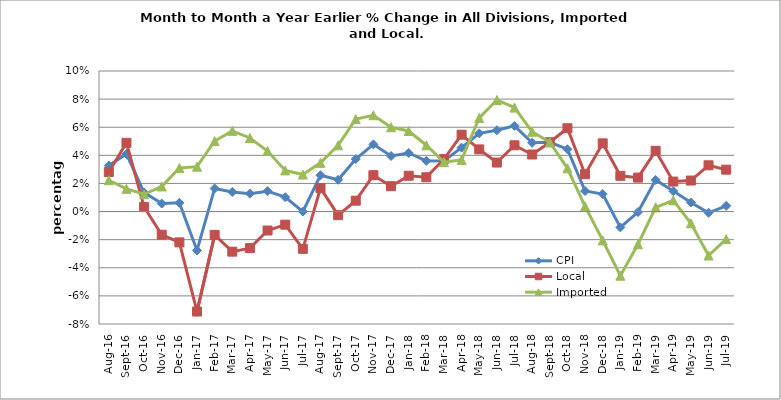
| Category | CPI | Local | Imported |
|---|---|---|---|
| 2016-08-01 | 0.033 | 0.028 | 0.022 |
| 2016-09-01 | 0.041 | 0.049 | 0.016 |
| 2016-10-01 | 0.014 | 0.003 | 0.012 |
| 2016-11-01 | 0.006 | -0.016 | 0.018 |
| 2016-12-01 | 0.006 | -0.022 | 0.031 |
| 2017-01-01 | -0.028 | -0.071 | 0.032 |
| 2017-02-01 | 0.016 | -0.017 | 0.05 |
| 2017-03-01 | 0.014 | -0.029 | 0.057 |
| 2017-04-01 | 0.013 | -0.026 | 0.052 |
| 2017-05-01 | 0.015 | -0.013 | 0.043 |
| 2017-06-01 | 0.01 | -0.009 | 0.029 |
| 2017-07-01 | 0 | -0.027 | 0.026 |
| 2017-08-01 | 0.026 | 0.017 | 0.035 |
| 2017-09-01 | 0.023 | -0.003 | 0.047 |
| 2017-10-01 | 0.037 | 0.008 | 0.066 |
| 2017-11-01 | 0.048 | 0.026 | 0.069 |
| 2017-12-01 | 0.04 | 0.018 | 0.06 |
| 2018-01-01 | 0.042 | 0.025 | 0.057 |
| 2018-02-01 | 0.036 | 0.024 | 0.047 |
| 2018-03-01 | 0.036 | 0.037 | 0.035 |
| 2018-04-01 | 0.045 | 0.055 | 0.037 |
| 2018-05-01 | 0.056 | 0.044 | 0.067 |
| 2018-06-01 | 0.058 | 0.035 | 0.079 |
| 2018-07-01 | 0.061 | 0.047 | 0.074 |
| 2018-08-01 | 0.049 | 0.041 | 0.057 |
| 2018-09-01 | 0.049 | 0.049 | 0.049 |
| 2018-10-01 | 0.044 | 0.059 | 0.031 |
| 2018-11-01 | 0.015 | 0.027 | 0.004 |
| 2018-12-01 | 0.012 | 0.049 | -0.021 |
| 2019-01-01 | -0.011 | 0.025 | -0.046 |
| 2019-02-01 | 0 | 0.024 | -0.023 |
| 2019-03-01 | 0.023 | 0.043 | 0.003 |
| 2019-04-01 | 0.015 | 0.021 | 0.008 |
| 2019-05-01 | 0.006 | 0.022 | -0.008 |
| 2019-06-01 | -0.001 | 0.033 | -0.031 |
| 2019-07-01 | 0.004 | 0.03 | -0.02 |